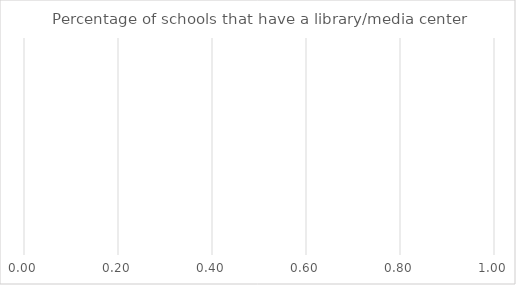
| Category | Benchmark | Entire LEA  | Title IV-A Identified Schools |
|---|---|---|---|
| Percentage of schools that have a library/media center | 0 | 0 | 0 |